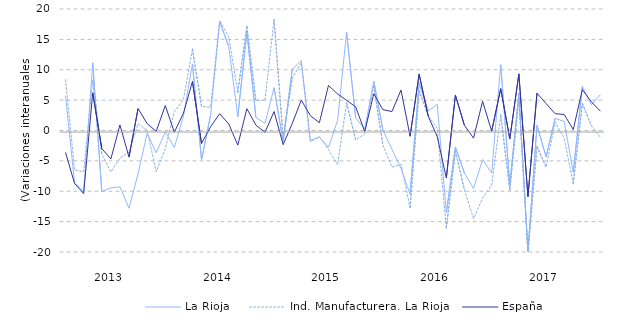
| Category | La Rioja | Ind. Manufacturera. La Rioja | España |
|---|---|---|---|
| nan | 5.721 | 8.373 | -3.619 |
| nan | -8.625 | -6.507 | -8.73 |
| nan | -9.997 | -6.785 | -10.384 |
| nan | 11.147 | 8.27 | 6.216 |
| nan | -10.052 | -3.915 | -2.984 |
| 2013.0 | -9.454 | -6.828 | -4.69 |
| nan | -9.276 | -4.519 | 0.92 |
| nan | -12.805 | -3.61 | -4.371 |
| nan | -7.103 | 1.107 | 3.619 |
| nan | -0.477 | 0.045 | 1.14 |
| nan | -3.65 | -6.788 | -0.138 |
| nan | -0.22 | -3.003 | 4.105 |
| nan | -2.791 | 3.075 | -0.276 |
| nan | 2.355 | 5.079 | 2.827 |
| nan | 10.969 | 13.422 | 8.072 |
| nan | -4.826 | 3.952 | -2.142 |
| nan | 2.539 | 3.817 | 0.617 |
| 2014.0 | 17.922 | 18.12 | 2.755 |
| nan | 13.83 | 15.404 | 1.093 |
| nan | 2.271 | 6.307 | -2.412 |
| nan | 16.237 | 17.104 | 3.591 |
| nan | 2.118 | 4.9 | 0.879 |
| nan | 1.196 | 5.036 | -0.301 |
| nan | 7.042 | 18.224 | 3.127 |
| nan | -1.861 | -1.251 | -2.334 |
| nan | 10.054 | 8.614 | 1.141 |
| nan | 11.523 | 11.167 | 5 |
| nan | -1.63 | -1.847 | 2.453 |
| nan | -1.088 | -1.017 | 1.29 |
| 2015.0 | -2.783 | -3.127 | 7.407 |
| nan | 1.635 | -5.639 | 6.017 |
| nan | 16.185 | 4.549 | 4.961 |
| nan | 2.073 | -1.548 | 3.884 |
| nan | 0.243 | -0.575 | -0.158 |
| nan | 8.146 | 7.324 | 6.064 |
| nan | 0.113 | -2.375 | 3.434 |
| nan | -3.081 | -6.035 | 3.121 |
| nan | -6.241 | -5.569 | 6.662 |
| nan | -10.451 | -12.688 | -0.941 |
| nan | 7.823 | 6.583 | 9.278 |
| nan | 3.219 | 2.416 | 2.369 |
| 2016.0 | 4.325 | 0.367 | -1.023 |
| nan | -13.546 | -16.06 | -7.815 |
| nan | -2.71 | -3.37 | 5.818 |
| nan | -7.019 | -9.814 | 0.832 |
| nan | -9.562 | -14.501 | -1.258 |
| nan | -4.769 | -11.14 | 4.812 |
| nan | -7.007 | -9.001 | -0.117 |
| nan | 10.829 | 2.576 | 6.884 |
| nan | -8.96 | -9.812 | -1.373 |
| nan | 6.172 | 5.4 | 9.323 |
| nan | -19.744 | -20.178 | -10.87 |
| nan | 0.857 | -2.585 | 6.147 |
| 2017.0 | -4.33 | -6.032 | 4.435 |
| nan | 2.004 | 1.383 | 2.772 |
| nan | 1.48 | -1.281 | 2.635 |
| nan | -6.885 | -8.76 | 0.16 |
| nan | 7.265 | 4.455 | 6.735 |
| nan | 4.246 | 0.772 | 4.716 |
| nan | 5.909 | -1.122 | 3.167 |